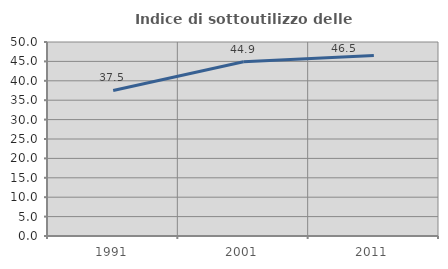
| Category | Indice di sottoutilizzo delle abitazioni  |
|---|---|
| 1991.0 | 37.507 |
| 2001.0 | 44.891 |
| 2011.0 | 46.518 |